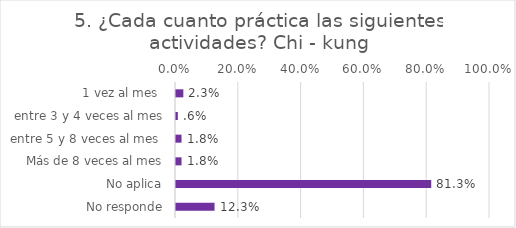
| Category | Series 0 |
|---|---|
| 1 vez al mes  | 0.023 |
| entre 3 y 4 veces al mes | 0.006 |
| entre 5 y 8 veces al mes  | 0.018 |
| Más de 8 veces al mes | 0.018 |
| No aplica | 0.813 |
| No responde | 0.123 |